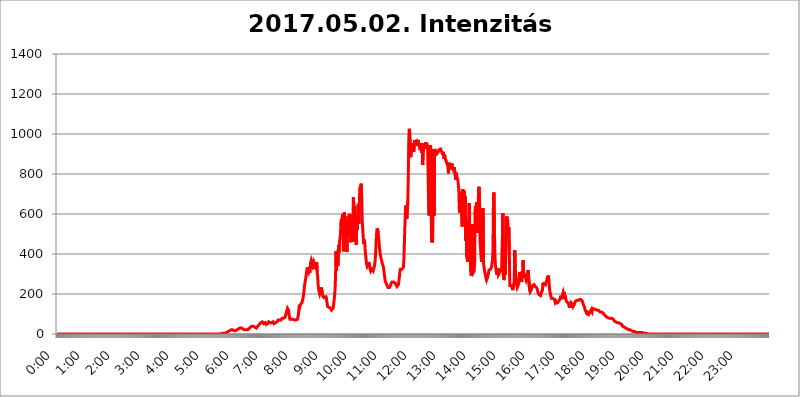
| Category | 2017.05.02. Intenzitás [W/m^2] |
|---|---|
| 0.0 | 0 |
| 0.0006944444444444445 | 0 |
| 0.001388888888888889 | 0 |
| 0.0020833333333333333 | 0 |
| 0.002777777777777778 | 0 |
| 0.003472222222222222 | 0 |
| 0.004166666666666667 | 0 |
| 0.004861111111111111 | 0 |
| 0.005555555555555556 | 0 |
| 0.0062499999999999995 | 0 |
| 0.006944444444444444 | 0 |
| 0.007638888888888889 | 0 |
| 0.008333333333333333 | 0 |
| 0.009027777777777779 | 0 |
| 0.009722222222222222 | 0 |
| 0.010416666666666666 | 0 |
| 0.011111111111111112 | 0 |
| 0.011805555555555555 | 0 |
| 0.012499999999999999 | 0 |
| 0.013194444444444444 | 0 |
| 0.013888888888888888 | 0 |
| 0.014583333333333332 | 0 |
| 0.015277777777777777 | 0 |
| 0.015972222222222224 | 0 |
| 0.016666666666666666 | 0 |
| 0.017361111111111112 | 0 |
| 0.018055555555555557 | 0 |
| 0.01875 | 0 |
| 0.019444444444444445 | 0 |
| 0.02013888888888889 | 0 |
| 0.020833333333333332 | 0 |
| 0.02152777777777778 | 0 |
| 0.022222222222222223 | 0 |
| 0.02291666666666667 | 0 |
| 0.02361111111111111 | 0 |
| 0.024305555555555556 | 0 |
| 0.024999999999999998 | 0 |
| 0.025694444444444447 | 0 |
| 0.02638888888888889 | 0 |
| 0.027083333333333334 | 0 |
| 0.027777777777777776 | 0 |
| 0.02847222222222222 | 0 |
| 0.029166666666666664 | 0 |
| 0.029861111111111113 | 0 |
| 0.030555555555555555 | 0 |
| 0.03125 | 0 |
| 0.03194444444444445 | 0 |
| 0.03263888888888889 | 0 |
| 0.03333333333333333 | 0 |
| 0.034027777777777775 | 0 |
| 0.034722222222222224 | 0 |
| 0.035416666666666666 | 0 |
| 0.036111111111111115 | 0 |
| 0.03680555555555556 | 0 |
| 0.0375 | 0 |
| 0.03819444444444444 | 0 |
| 0.03888888888888889 | 0 |
| 0.03958333333333333 | 0 |
| 0.04027777777777778 | 0 |
| 0.04097222222222222 | 0 |
| 0.041666666666666664 | 0 |
| 0.042361111111111106 | 0 |
| 0.04305555555555556 | 0 |
| 0.043750000000000004 | 0 |
| 0.044444444444444446 | 0 |
| 0.04513888888888889 | 0 |
| 0.04583333333333334 | 0 |
| 0.04652777777777778 | 0 |
| 0.04722222222222222 | 0 |
| 0.04791666666666666 | 0 |
| 0.04861111111111111 | 0 |
| 0.049305555555555554 | 0 |
| 0.049999999999999996 | 0 |
| 0.05069444444444445 | 0 |
| 0.051388888888888894 | 0 |
| 0.052083333333333336 | 0 |
| 0.05277777777777778 | 0 |
| 0.05347222222222222 | 0 |
| 0.05416666666666667 | 0 |
| 0.05486111111111111 | 0 |
| 0.05555555555555555 | 0 |
| 0.05625 | 0 |
| 0.05694444444444444 | 0 |
| 0.057638888888888885 | 0 |
| 0.05833333333333333 | 0 |
| 0.05902777777777778 | 0 |
| 0.059722222222222225 | 0 |
| 0.06041666666666667 | 0 |
| 0.061111111111111116 | 0 |
| 0.06180555555555556 | 0 |
| 0.0625 | 0 |
| 0.06319444444444444 | 0 |
| 0.06388888888888888 | 0 |
| 0.06458333333333334 | 0 |
| 0.06527777777777778 | 0 |
| 0.06597222222222222 | 0 |
| 0.06666666666666667 | 0 |
| 0.06736111111111111 | 0 |
| 0.06805555555555555 | 0 |
| 0.06874999999999999 | 0 |
| 0.06944444444444443 | 0 |
| 0.07013888888888889 | 0 |
| 0.07083333333333333 | 0 |
| 0.07152777777777779 | 0 |
| 0.07222222222222223 | 0 |
| 0.07291666666666667 | 0 |
| 0.07361111111111111 | 0 |
| 0.07430555555555556 | 0 |
| 0.075 | 0 |
| 0.07569444444444444 | 0 |
| 0.0763888888888889 | 0 |
| 0.07708333333333334 | 0 |
| 0.07777777777777778 | 0 |
| 0.07847222222222222 | 0 |
| 0.07916666666666666 | 0 |
| 0.0798611111111111 | 0 |
| 0.08055555555555556 | 0 |
| 0.08125 | 0 |
| 0.08194444444444444 | 0 |
| 0.08263888888888889 | 0 |
| 0.08333333333333333 | 0 |
| 0.08402777777777777 | 0 |
| 0.08472222222222221 | 0 |
| 0.08541666666666665 | 0 |
| 0.08611111111111112 | 0 |
| 0.08680555555555557 | 0 |
| 0.08750000000000001 | 0 |
| 0.08819444444444445 | 0 |
| 0.08888888888888889 | 0 |
| 0.08958333333333333 | 0 |
| 0.09027777777777778 | 0 |
| 0.09097222222222222 | 0 |
| 0.09166666666666667 | 0 |
| 0.09236111111111112 | 0 |
| 0.09305555555555556 | 0 |
| 0.09375 | 0 |
| 0.09444444444444444 | 0 |
| 0.09513888888888888 | 0 |
| 0.09583333333333333 | 0 |
| 0.09652777777777777 | 0 |
| 0.09722222222222222 | 0 |
| 0.09791666666666667 | 0 |
| 0.09861111111111111 | 0 |
| 0.09930555555555555 | 0 |
| 0.09999999999999999 | 0 |
| 0.10069444444444443 | 0 |
| 0.1013888888888889 | 0 |
| 0.10208333333333335 | 0 |
| 0.10277777777777779 | 0 |
| 0.10347222222222223 | 0 |
| 0.10416666666666667 | 0 |
| 0.10486111111111111 | 0 |
| 0.10555555555555556 | 0 |
| 0.10625 | 0 |
| 0.10694444444444444 | 0 |
| 0.1076388888888889 | 0 |
| 0.10833333333333334 | 0 |
| 0.10902777777777778 | 0 |
| 0.10972222222222222 | 0 |
| 0.1111111111111111 | 0 |
| 0.11180555555555556 | 0 |
| 0.11180555555555556 | 0 |
| 0.1125 | 0 |
| 0.11319444444444444 | 0 |
| 0.11388888888888889 | 0 |
| 0.11458333333333333 | 0 |
| 0.11527777777777777 | 0 |
| 0.11597222222222221 | 0 |
| 0.11666666666666665 | 0 |
| 0.1173611111111111 | 0 |
| 0.11805555555555557 | 0 |
| 0.11944444444444445 | 0 |
| 0.12013888888888889 | 0 |
| 0.12083333333333333 | 0 |
| 0.12152777777777778 | 0 |
| 0.12222222222222223 | 0 |
| 0.12291666666666667 | 0 |
| 0.12291666666666667 | 0 |
| 0.12361111111111112 | 0 |
| 0.12430555555555556 | 0 |
| 0.125 | 0 |
| 0.12569444444444444 | 0 |
| 0.12638888888888888 | 0 |
| 0.12708333333333333 | 0 |
| 0.16875 | 0 |
| 0.12847222222222224 | 0 |
| 0.12916666666666668 | 0 |
| 0.12986111111111112 | 0 |
| 0.13055555555555556 | 0 |
| 0.13125 | 0 |
| 0.13194444444444445 | 0 |
| 0.1326388888888889 | 0 |
| 0.13333333333333333 | 0 |
| 0.13402777777777777 | 0 |
| 0.13402777777777777 | 0 |
| 0.13472222222222222 | 0 |
| 0.13541666666666666 | 0 |
| 0.1361111111111111 | 0 |
| 0.13749999999999998 | 0 |
| 0.13819444444444443 | 0 |
| 0.1388888888888889 | 0 |
| 0.13958333333333334 | 0 |
| 0.14027777777777778 | 0 |
| 0.14097222222222222 | 0 |
| 0.14166666666666666 | 0 |
| 0.1423611111111111 | 0 |
| 0.14305555555555557 | 0 |
| 0.14375000000000002 | 0 |
| 0.14444444444444446 | 0 |
| 0.1451388888888889 | 0 |
| 0.1451388888888889 | 0 |
| 0.14652777777777778 | 0 |
| 0.14722222222222223 | 0 |
| 0.14791666666666667 | 0 |
| 0.1486111111111111 | 0 |
| 0.14930555555555555 | 0 |
| 0.15 | 0 |
| 0.15069444444444444 | 0 |
| 0.15138888888888888 | 0 |
| 0.15208333333333332 | 0 |
| 0.15277777777777776 | 0 |
| 0.15347222222222223 | 0 |
| 0.15416666666666667 | 0 |
| 0.15486111111111112 | 0 |
| 0.15555555555555556 | 0 |
| 0.15625 | 0 |
| 0.15694444444444444 | 0 |
| 0.15763888888888888 | 0 |
| 0.15833333333333333 | 0 |
| 0.15902777777777777 | 0 |
| 0.15972222222222224 | 0 |
| 0.16041666666666668 | 0 |
| 0.16111111111111112 | 0 |
| 0.16180555555555556 | 0 |
| 0.1625 | 0 |
| 0.16319444444444445 | 0 |
| 0.1638888888888889 | 0 |
| 0.16458333333333333 | 0 |
| 0.16527777777777777 | 0 |
| 0.16597222222222222 | 0 |
| 0.16666666666666666 | 0 |
| 0.1673611111111111 | 0 |
| 0.16805555555555554 | 0 |
| 0.16874999999999998 | 0 |
| 0.16944444444444443 | 0 |
| 0.17013888888888887 | 0 |
| 0.1708333333333333 | 0 |
| 0.17152777777777775 | 0 |
| 0.17222222222222225 | 0 |
| 0.1729166666666667 | 0 |
| 0.17361111111111113 | 0 |
| 0.17430555555555557 | 0 |
| 0.17500000000000002 | 0 |
| 0.17569444444444446 | 0 |
| 0.1763888888888889 | 0 |
| 0.17708333333333334 | 0 |
| 0.17777777777777778 | 0 |
| 0.17847222222222223 | 0 |
| 0.17916666666666667 | 0 |
| 0.1798611111111111 | 0 |
| 0.18055555555555555 | 0 |
| 0.18125 | 0 |
| 0.18194444444444444 | 0 |
| 0.1826388888888889 | 0 |
| 0.18333333333333335 | 0 |
| 0.1840277777777778 | 0 |
| 0.18472222222222223 | 0 |
| 0.18541666666666667 | 0 |
| 0.18611111111111112 | 0 |
| 0.18680555555555556 | 0 |
| 0.1875 | 0 |
| 0.18819444444444444 | 0 |
| 0.18888888888888888 | 0 |
| 0.18958333333333333 | 0 |
| 0.19027777777777777 | 0 |
| 0.1909722222222222 | 0 |
| 0.19166666666666665 | 0 |
| 0.19236111111111112 | 0 |
| 0.19305555555555554 | 0 |
| 0.19375 | 0 |
| 0.19444444444444445 | 0 |
| 0.1951388888888889 | 0 |
| 0.19583333333333333 | 0 |
| 0.19652777777777777 | 0 |
| 0.19722222222222222 | 0 |
| 0.19791666666666666 | 0 |
| 0.1986111111111111 | 0 |
| 0.19930555555555554 | 0 |
| 0.19999999999999998 | 0 |
| 0.20069444444444443 | 0 |
| 0.20138888888888887 | 0 |
| 0.2020833333333333 | 0 |
| 0.2027777777777778 | 0 |
| 0.2034722222222222 | 0 |
| 0.2041666666666667 | 0 |
| 0.20486111111111113 | 0 |
| 0.20555555555555557 | 0 |
| 0.20625000000000002 | 0 |
| 0.20694444444444446 | 0 |
| 0.2076388888888889 | 0 |
| 0.20833333333333334 | 0 |
| 0.20902777777777778 | 0 |
| 0.20972222222222223 | 0 |
| 0.21041666666666667 | 0 |
| 0.2111111111111111 | 0 |
| 0.21180555555555555 | 0 |
| 0.2125 | 0 |
| 0.21319444444444444 | 0 |
| 0.2138888888888889 | 0 |
| 0.21458333333333335 | 0 |
| 0.2152777777777778 | 0 |
| 0.21597222222222223 | 0 |
| 0.21666666666666667 | 0 |
| 0.21736111111111112 | 0 |
| 0.21805555555555556 | 0 |
| 0.21875 | 0 |
| 0.21944444444444444 | 0 |
| 0.22013888888888888 | 0 |
| 0.22083333333333333 | 0 |
| 0.22152777777777777 | 0 |
| 0.2222222222222222 | 0 |
| 0.22291666666666665 | 0 |
| 0.2236111111111111 | 0 |
| 0.22430555555555556 | 0 |
| 0.225 | 0 |
| 0.22569444444444445 | 0 |
| 0.2263888888888889 | 0 |
| 0.22708333333333333 | 0 |
| 0.22777777777777777 | 0 |
| 0.22847222222222222 | 0 |
| 0.22916666666666666 | 0 |
| 0.2298611111111111 | 3.525 |
| 0.23055555555555554 | 3.525 |
| 0.23124999999999998 | 3.525 |
| 0.23194444444444443 | 3.525 |
| 0.23263888888888887 | 3.525 |
| 0.2333333333333333 | 3.525 |
| 0.2340277777777778 | 3.525 |
| 0.2347222222222222 | 3.525 |
| 0.2354166666666667 | 3.525 |
| 0.23611111111111113 | 3.525 |
| 0.23680555555555557 | 7.887 |
| 0.23750000000000002 | 7.887 |
| 0.23819444444444446 | 7.887 |
| 0.2388888888888889 | 12.257 |
| 0.23958333333333334 | 12.257 |
| 0.24027777777777778 | 12.257 |
| 0.24097222222222223 | 12.257 |
| 0.24166666666666667 | 16.636 |
| 0.2423611111111111 | 21.024 |
| 0.24305555555555555 | 21.024 |
| 0.24375 | 21.024 |
| 0.24444444444444446 | 21.024 |
| 0.24513888888888888 | 21.024 |
| 0.24583333333333335 | 21.024 |
| 0.2465277777777778 | 16.636 |
| 0.24722222222222223 | 16.636 |
| 0.24791666666666667 | 16.636 |
| 0.24861111111111112 | 16.636 |
| 0.24930555555555556 | 16.636 |
| 0.25 | 16.636 |
| 0.25069444444444444 | 16.636 |
| 0.2513888888888889 | 21.024 |
| 0.2520833333333333 | 21.024 |
| 0.25277777777777777 | 21.024 |
| 0.2534722222222222 | 25.419 |
| 0.25416666666666665 | 25.419 |
| 0.2548611111111111 | 25.419 |
| 0.2555555555555556 | 29.823 |
| 0.25625000000000003 | 29.823 |
| 0.2569444444444445 | 29.823 |
| 0.2576388888888889 | 29.823 |
| 0.25833333333333336 | 29.823 |
| 0.2590277777777778 | 29.823 |
| 0.25972222222222224 | 25.419 |
| 0.2604166666666667 | 25.419 |
| 0.2611111111111111 | 21.024 |
| 0.26180555555555557 | 21.024 |
| 0.2625 | 21.024 |
| 0.26319444444444445 | 21.024 |
| 0.2638888888888889 | 21.024 |
| 0.26458333333333334 | 21.024 |
| 0.2652777777777778 | 21.024 |
| 0.2659722222222222 | 21.024 |
| 0.26666666666666666 | 21.024 |
| 0.2673611111111111 | 25.419 |
| 0.26805555555555555 | 25.419 |
| 0.26875 | 25.419 |
| 0.26944444444444443 | 29.823 |
| 0.2701388888888889 | 29.823 |
| 0.2708333333333333 | 34.234 |
| 0.27152777777777776 | 34.234 |
| 0.2722222222222222 | 38.653 |
| 0.27291666666666664 | 38.653 |
| 0.2736111111111111 | 38.653 |
| 0.2743055555555555 | 38.653 |
| 0.27499999999999997 | 38.653 |
| 0.27569444444444446 | 34.234 |
| 0.27638888888888885 | 34.234 |
| 0.27708333333333335 | 34.234 |
| 0.2777777777777778 | 29.823 |
| 0.27847222222222223 | 29.823 |
| 0.2791666666666667 | 29.823 |
| 0.2798611111111111 | 29.823 |
| 0.28055555555555556 | 34.234 |
| 0.28125 | 38.653 |
| 0.28194444444444444 | 38.653 |
| 0.2826388888888889 | 38.653 |
| 0.2833333333333333 | 47.511 |
| 0.28402777777777777 | 51.951 |
| 0.2847222222222222 | 51.951 |
| 0.28541666666666665 | 56.398 |
| 0.28611111111111115 | 60.85 |
| 0.28680555555555554 | 56.398 |
| 0.28750000000000003 | 60.85 |
| 0.2881944444444445 | 60.85 |
| 0.2888888888888889 | 56.398 |
| 0.28958333333333336 | 51.951 |
| 0.2902777777777778 | 51.951 |
| 0.29097222222222224 | 51.951 |
| 0.2916666666666667 | 56.398 |
| 0.2923611111111111 | 51.951 |
| 0.29305555555555557 | 47.511 |
| 0.29375 | 43.079 |
| 0.29444444444444445 | 47.511 |
| 0.2951388888888889 | 51.951 |
| 0.29583333333333334 | 56.398 |
| 0.2965277777777778 | 60.85 |
| 0.2972222222222222 | 60.85 |
| 0.29791666666666666 | 60.85 |
| 0.2986111111111111 | 56.398 |
| 0.29930555555555555 | 56.398 |
| 0.3 | 56.398 |
| 0.30069444444444443 | 56.398 |
| 0.3013888888888889 | 56.398 |
| 0.3020833333333333 | 60.85 |
| 0.30277777777777776 | 60.85 |
| 0.3034722222222222 | 56.398 |
| 0.30416666666666664 | 51.951 |
| 0.3048611111111111 | 51.951 |
| 0.3055555555555555 | 56.398 |
| 0.30624999999999997 | 56.398 |
| 0.3069444444444444 | 56.398 |
| 0.3076388888888889 | 56.398 |
| 0.30833333333333335 | 60.85 |
| 0.3090277777777778 | 65.31 |
| 0.30972222222222223 | 69.775 |
| 0.3104166666666667 | 74.246 |
| 0.3111111111111111 | 74.246 |
| 0.31180555555555556 | 69.775 |
| 0.3125 | 69.775 |
| 0.31319444444444444 | 65.31 |
| 0.3138888888888889 | 69.775 |
| 0.3145833333333333 | 74.246 |
| 0.31527777777777777 | 78.722 |
| 0.3159722222222222 | 78.722 |
| 0.31666666666666665 | 78.722 |
| 0.31736111111111115 | 78.722 |
| 0.31805555555555554 | 74.246 |
| 0.31875000000000003 | 78.722 |
| 0.3194444444444445 | 83.205 |
| 0.3201388888888889 | 92.184 |
| 0.32083333333333336 | 101.184 |
| 0.3215277777777778 | 110.201 |
| 0.32222222222222224 | 119.235 |
| 0.3229166666666667 | 128.284 |
| 0.3236111111111111 | 128.284 |
| 0.32430555555555557 | 119.235 |
| 0.325 | 101.184 |
| 0.32569444444444445 | 83.205 |
| 0.3263888888888889 | 74.246 |
| 0.32708333333333334 | 69.775 |
| 0.3277777777777778 | 69.775 |
| 0.3284722222222222 | 74.246 |
| 0.32916666666666666 | 78.722 |
| 0.3298611111111111 | 78.722 |
| 0.33055555555555555 | 74.246 |
| 0.33125 | 69.775 |
| 0.33194444444444443 | 69.775 |
| 0.3326388888888889 | 69.775 |
| 0.3333333333333333 | 65.31 |
| 0.3340277777777778 | 65.31 |
| 0.3347222222222222 | 69.775 |
| 0.3354166666666667 | 65.31 |
| 0.3361111111111111 | 69.775 |
| 0.3368055555555556 | 74.246 |
| 0.33749999999999997 | 83.205 |
| 0.33819444444444446 | 96.682 |
| 0.33888888888888885 | 123.758 |
| 0.33958333333333335 | 146.423 |
| 0.34027777777777773 | 137.347 |
| 0.34097222222222223 | 146.423 |
| 0.3416666666666666 | 141.884 |
| 0.3423611111111111 | 146.423 |
| 0.3430555555555555 | 155.509 |
| 0.34375 | 164.605 |
| 0.3444444444444445 | 173.709 |
| 0.3451388888888889 | 178.264 |
| 0.3458333333333334 | 205.62 |
| 0.34652777777777777 | 233 |
| 0.34722222222222227 | 251.251 |
| 0.34791666666666665 | 255.813 |
| 0.34861111111111115 | 251.251 |
| 0.34930555555555554 | 296.808 |
| 0.35000000000000003 | 319.517 |
| 0.3506944444444444 | 333.113 |
| 0.3513888888888889 | 328.584 |
| 0.3520833333333333 | 333.113 |
| 0.3527777777777778 | 310.44 |
| 0.3534722222222222 | 319.517 |
| 0.3541666666666667 | 305.898 |
| 0.3548611111111111 | 310.44 |
| 0.35555555555555557 | 360.221 |
| 0.35625 | 369.23 |
| 0.35694444444444445 | 373.729 |
| 0.3576388888888889 | 364.728 |
| 0.35833333333333334 | 342.162 |
| 0.3590277777777778 | 351.198 |
| 0.3597222222222222 | 360.221 |
| 0.36041666666666666 | 351.198 |
| 0.3611111111111111 | 355.712 |
| 0.36180555555555555 | 324.052 |
| 0.3625 | 337.639 |
| 0.36319444444444443 | 333.113 |
| 0.3638888888888889 | 360.221 |
| 0.3645833333333333 | 310.44 |
| 0.3652777777777778 | 287.709 |
| 0.3659722222222222 | 242.127 |
| 0.3666666666666667 | 223.873 |
| 0.3673611111111111 | 210.182 |
| 0.3680555555555556 | 201.058 |
| 0.36874999999999997 | 205.62 |
| 0.36944444444444446 | 219.309 |
| 0.37013888888888885 | 233 |
| 0.37083333333333335 | 228.436 |
| 0.37152777777777773 | 210.182 |
| 0.37222222222222223 | 191.937 |
| 0.3729166666666666 | 187.378 |
| 0.3736111111111111 | 182.82 |
| 0.3743055555555555 | 178.264 |
| 0.375 | 182.82 |
| 0.3756944444444445 | 182.82 |
| 0.3763888888888889 | 191.937 |
| 0.3770833333333334 | 187.378 |
| 0.37777777777777777 | 169.156 |
| 0.37847222222222227 | 155.509 |
| 0.37916666666666665 | 137.347 |
| 0.37986111111111115 | 132.814 |
| 0.38055555555555554 | 132.814 |
| 0.38125000000000003 | 132.814 |
| 0.3819444444444444 | 128.284 |
| 0.3826388888888889 | 128.284 |
| 0.3833333333333333 | 128.284 |
| 0.3840277777777778 | 123.758 |
| 0.3847222222222222 | 119.235 |
| 0.3854166666666667 | 119.235 |
| 0.3861111111111111 | 123.758 |
| 0.38680555555555557 | 128.284 |
| 0.3875 | 141.884 |
| 0.38819444444444445 | 164.605 |
| 0.3888888888888889 | 187.378 |
| 0.38958333333333334 | 219.309 |
| 0.3902777777777778 | 283.156 |
| 0.3909722222222222 | 414.035 |
| 0.39166666666666666 | 314.98 |
| 0.3923611111111111 | 378.224 |
| 0.39305555555555555 | 373.729 |
| 0.39375 | 342.162 |
| 0.39444444444444443 | 445.129 |
| 0.3951388888888889 | 405.108 |
| 0.3958333333333333 | 458.38 |
| 0.3965277777777778 | 475.972 |
| 0.3972222222222222 | 497.836 |
| 0.3979166666666667 | 566.793 |
| 0.3986111111111111 | 566.793 |
| 0.3993055555555556 | 575.299 |
| 0.39999999999999997 | 592.233 |
| 0.40069444444444446 | 600.661 |
| 0.40138888888888885 | 414.035 |
| 0.40208333333333335 | 562.53 |
| 0.40277777777777773 | 609.062 |
| 0.40347222222222223 | 562.53 |
| 0.4041666666666666 | 588.009 |
| 0.4048611111111111 | 549.704 |
| 0.4055555555555555 | 566.793 |
| 0.40625 | 409.574 |
| 0.4069444444444445 | 566.793 |
| 0.4076388888888889 | 493.475 |
| 0.4083333333333334 | 558.261 |
| 0.40902777777777777 | 592.233 |
| 0.40972222222222227 | 600.661 |
| 0.41041666666666665 | 600.661 |
| 0.41111111111111115 | 579.542 |
| 0.41180555555555554 | 458.38 |
| 0.41250000000000003 | 596.45 |
| 0.4131944444444444 | 515.223 |
| 0.4138888888888889 | 462.786 |
| 0.4145833333333333 | 528.2 |
| 0.4152777777777778 | 683.473 |
| 0.4159722222222222 | 642.4 |
| 0.4166666666666667 | 613.252 |
| 0.4173611111111111 | 638.256 |
| 0.41805555555555557 | 462.786 |
| 0.41875 | 549.704 |
| 0.41944444444444445 | 445.129 |
| 0.4201388888888889 | 596.45 |
| 0.42083333333333334 | 519.555 |
| 0.4215277777777778 | 592.233 |
| 0.4222222222222222 | 650.667 |
| 0.42291666666666666 | 549.704 |
| 0.4236111111111111 | 646.537 |
| 0.42430555555555555 | 727.896 |
| 0.425 | 727.896 |
| 0.42569444444444443 | 743.859 |
| 0.4263888888888889 | 751.803 |
| 0.4270833333333333 | 658.909 |
| 0.4277777777777778 | 562.53 |
| 0.4284722222222222 | 562.53 |
| 0.4291666666666667 | 480.356 |
| 0.4298611111111111 | 449.551 |
| 0.4305555555555556 | 471.582 |
| 0.43124999999999997 | 458.38 |
| 0.43194444444444446 | 414.035 |
| 0.43263888888888885 | 391.685 |
| 0.43333333333333335 | 364.728 |
| 0.43402777777777773 | 346.682 |
| 0.43472222222222223 | 337.639 |
| 0.4354166666666666 | 333.113 |
| 0.4361111111111111 | 346.682 |
| 0.4368055555555555 | 360.221 |
| 0.4375 | 355.712 |
| 0.4381944444444445 | 337.639 |
| 0.4388888888888889 | 324.052 |
| 0.4395833333333334 | 314.98 |
| 0.44027777777777777 | 314.98 |
| 0.44097222222222227 | 324.052 |
| 0.44166666666666665 | 319.517 |
| 0.44236111111111115 | 319.517 |
| 0.44305555555555554 | 314.98 |
| 0.44375000000000003 | 319.517 |
| 0.4444444444444444 | 333.113 |
| 0.4451388888888889 | 346.682 |
| 0.4458333333333333 | 364.728 |
| 0.4465277777777778 | 405.108 |
| 0.4472222222222222 | 458.38 |
| 0.4479166666666667 | 502.192 |
| 0.4486111111111111 | 528.2 |
| 0.44930555555555557 | 523.88 |
| 0.45 | 515.223 |
| 0.45069444444444445 | 484.735 |
| 0.4513888888888889 | 458.38 |
| 0.45208333333333334 | 427.39 |
| 0.4527777777777778 | 405.108 |
| 0.4534722222222222 | 391.685 |
| 0.45416666666666666 | 378.224 |
| 0.4548611111111111 | 369.23 |
| 0.45555555555555555 | 355.712 |
| 0.45625 | 351.198 |
| 0.45694444444444443 | 342.162 |
| 0.4576388888888889 | 328.584 |
| 0.4583333333333333 | 310.44 |
| 0.4590277777777778 | 292.259 |
| 0.4597222222222222 | 269.49 |
| 0.4604166666666667 | 260.373 |
| 0.4611111111111111 | 255.813 |
| 0.4618055555555556 | 251.251 |
| 0.46249999999999997 | 242.127 |
| 0.46319444444444446 | 242.127 |
| 0.46388888888888885 | 233 |
| 0.46458333333333335 | 228.436 |
| 0.46527777777777773 | 228.436 |
| 0.46597222222222223 | 233 |
| 0.4666666666666666 | 237.564 |
| 0.4673611111111111 | 242.127 |
| 0.4680555555555555 | 251.251 |
| 0.46875 | 255.813 |
| 0.4694444444444445 | 260.373 |
| 0.4701388888888889 | 264.932 |
| 0.4708333333333334 | 264.932 |
| 0.47152777777777777 | 260.373 |
| 0.47222222222222227 | 260.373 |
| 0.47291666666666665 | 260.373 |
| 0.47361111111111115 | 255.813 |
| 0.47430555555555554 | 251.251 |
| 0.47500000000000003 | 246.689 |
| 0.4756944444444444 | 242.127 |
| 0.4763888888888889 | 237.564 |
| 0.4770833333333333 | 233 |
| 0.4777777777777778 | 237.564 |
| 0.4784722222222222 | 246.689 |
| 0.4791666666666667 | 264.932 |
| 0.4798611111111111 | 287.709 |
| 0.48055555555555557 | 310.44 |
| 0.48125 | 324.052 |
| 0.48194444444444445 | 328.584 |
| 0.4826388888888889 | 324.052 |
| 0.48333333333333334 | 324.052 |
| 0.4840277777777778 | 319.517 |
| 0.4847222222222222 | 319.517 |
| 0.48541666666666666 | 333.113 |
| 0.4861111111111111 | 369.23 |
| 0.48680555555555555 | 445.129 |
| 0.4875 | 532.513 |
| 0.48819444444444443 | 600.661 |
| 0.4888888888888889 | 642.4 |
| 0.4895833333333333 | 617.436 |
| 0.4902777777777778 | 575.299 |
| 0.4909722222222222 | 571.049 |
| 0.4916666666666667 | 663.019 |
| 0.4923611111111111 | 791.169 |
| 0.4930555555555556 | 977.508 |
| 0.49374999999999997 | 1026.06 |
| 0.49444444444444446 | 1003.65 |
| 0.49513888888888885 | 962.555 |
| 0.49583333333333335 | 883.516 |
| 0.49652777777777773 | 936.33 |
| 0.49722222222222223 | 943.832 |
| 0.4979166666666666 | 955.071 |
| 0.4986111111111111 | 932.576 |
| 0.4993055555555555 | 928.819 |
| 0.5 | 909.996 |
| 0.5006944444444444 | 943.832 |
| 0.5013888888888889 | 970.034 |
| 0.5020833333333333 | 966.295 |
| 0.5027777777777778 | 955.071 |
| 0.5034722222222222 | 951.327 |
| 0.5041666666666667 | 962.555 |
| 0.5048611111111111 | 962.555 |
| 0.5055555555555555 | 940.082 |
| 0.50625 | 970.034 |
| 0.5069444444444444 | 951.327 |
| 0.5076388888888889 | 940.082 |
| 0.5083333333333333 | 943.832 |
| 0.5090277777777777 | 955.071 |
| 0.5097222222222222 | 955.071 |
| 0.5104166666666666 | 958.814 |
| 0.5111111111111112 | 906.223 |
| 0.5118055555555555 | 951.327 |
| 0.5125000000000001 | 845.365 |
| 0.5131944444444444 | 902.447 |
| 0.513888888888889 | 925.06 |
| 0.5145833333333333 | 955.071 |
| 0.5152777777777778 | 951.327 |
| 0.5159722222222222 | 925.06 |
| 0.5166666666666667 | 958.814 |
| 0.517361111111111 | 928.819 |
| 0.5180555555555556 | 955.071 |
| 0.5187499999999999 | 943.832 |
| 0.5194444444444445 | 936.33 |
| 0.5201388888888888 | 798.974 |
| 0.5208333333333334 | 654.791 |
| 0.5215277777777778 | 592.233 |
| 0.5222222222222223 | 883.516 |
| 0.5229166666666667 | 932.576 |
| 0.5236111111111111 | 943.832 |
| 0.5243055555555556 | 667.123 |
| 0.525 | 458.38 |
| 0.5256944444444445 | 471.582 |
| 0.5263888888888889 | 458.38 |
| 0.5270833333333333 | 798.974 |
| 0.5277777777777778 | 925.06 |
| 0.5284722222222222 | 592.233 |
| 0.5291666666666667 | 906.223 |
| 0.5298611111111111 | 925.06 |
| 0.5305555555555556 | 891.099 |
| 0.53125 | 909.996 |
| 0.5319444444444444 | 909.996 |
| 0.5326388888888889 | 902.447 |
| 0.5333333333333333 | 902.447 |
| 0.5340277777777778 | 906.223 |
| 0.5347222222222222 | 913.766 |
| 0.5354166666666667 | 921.298 |
| 0.5361111111111111 | 925.06 |
| 0.5368055555555555 | 917.534 |
| 0.5375 | 925.06 |
| 0.5381944444444444 | 925.06 |
| 0.5388888888888889 | 928.819 |
| 0.5395833333333333 | 909.996 |
| 0.5402777777777777 | 894.885 |
| 0.5409722222222222 | 909.996 |
| 0.5416666666666666 | 902.447 |
| 0.5423611111111112 | 875.918 |
| 0.5430555555555555 | 898.668 |
| 0.5437500000000001 | 887.309 |
| 0.5444444444444444 | 875.918 |
| 0.545138888888889 | 868.305 |
| 0.5458333333333333 | 872.114 |
| 0.5465277777777778 | 853.029 |
| 0.5472222222222222 | 845.365 |
| 0.5479166666666667 | 837.682 |
| 0.548611111111111 | 802.868 |
| 0.5493055555555556 | 849.199 |
| 0.5499999999999999 | 856.855 |
| 0.5506944444444445 | 829.981 |
| 0.5513888888888888 | 822.26 |
| 0.5520833333333334 | 837.682 |
| 0.5527777777777778 | 845.365 |
| 0.5534722222222223 | 853.029 |
| 0.5541666666666667 | 837.682 |
| 0.5548611111111111 | 833.834 |
| 0.5555555555555556 | 822.26 |
| 0.55625 | 826.123 |
| 0.5569444444444445 | 833.834 |
| 0.5576388888888889 | 806.757 |
| 0.5583333333333333 | 783.342 |
| 0.5590277777777778 | 771.559 |
| 0.5597222222222222 | 806.757 |
| 0.5604166666666667 | 783.342 |
| 0.5611111111111111 | 779.42 |
| 0.5618055555555556 | 771.559 |
| 0.5625 | 747.834 |
| 0.5631944444444444 | 719.877 |
| 0.5638888888888889 | 625.784 |
| 0.5645833333333333 | 604.864 |
| 0.5652777777777778 | 634.105 |
| 0.5659722222222222 | 646.537 |
| 0.5666666666666667 | 711.832 |
| 0.5673611111111111 | 707.8 |
| 0.5680555555555555 | 536.82 |
| 0.56875 | 723.889 |
| 0.5694444444444444 | 695.666 |
| 0.5701388888888889 | 703.762 |
| 0.5708333333333333 | 715.858 |
| 0.5715277777777777 | 650.667 |
| 0.5722222222222222 | 687.544 |
| 0.5729166666666666 | 467.187 |
| 0.5736111111111112 | 575.299 |
| 0.5743055555555555 | 387.202 |
| 0.5750000000000001 | 373.729 |
| 0.5756944444444444 | 360.221 |
| 0.576388888888889 | 360.221 |
| 0.5770833333333333 | 549.704 |
| 0.5777777777777778 | 654.791 |
| 0.5784722222222222 | 475.972 |
| 0.5791666666666667 | 489.108 |
| 0.579861111111111 | 314.98 |
| 0.5805555555555556 | 292.259 |
| 0.5812499999999999 | 310.44 |
| 0.5819444444444445 | 549.704 |
| 0.5826388888888888 | 324.052 |
| 0.5833333333333334 | 305.898 |
| 0.5840277777777778 | 301.354 |
| 0.5847222222222223 | 314.98 |
| 0.5854166666666667 | 360.221 |
| 0.5861111111111111 | 625.784 |
| 0.5868055555555556 | 629.948 |
| 0.5875 | 642.4 |
| 0.5881944444444445 | 658.909 |
| 0.5888888888888889 | 642.4 |
| 0.5895833333333333 | 506.542 |
| 0.5902777777777778 | 617.436 |
| 0.5909722222222222 | 727.896 |
| 0.5916666666666667 | 735.89 |
| 0.5923611111111111 | 650.667 |
| 0.5930555555555556 | 453.968 |
| 0.59375 | 422.943 |
| 0.5944444444444444 | 382.715 |
| 0.5951388888888889 | 360.221 |
| 0.5958333333333333 | 422.943 |
| 0.5965277777777778 | 617.436 |
| 0.5972222222222222 | 629.948 |
| 0.5979166666666667 | 351.198 |
| 0.5986111111111111 | 333.113 |
| 0.5993055555555555 | 314.98 |
| 0.6 | 301.354 |
| 0.6006944444444444 | 292.259 |
| 0.6013888888888889 | 278.603 |
| 0.6020833333333333 | 269.49 |
| 0.6027777777777777 | 274.047 |
| 0.6034722222222222 | 283.156 |
| 0.6041666666666666 | 292.259 |
| 0.6048611111111112 | 305.898 |
| 0.6055555555555555 | 319.517 |
| 0.6062500000000001 | 324.052 |
| 0.6069444444444444 | 314.98 |
| 0.607638888888889 | 324.052 |
| 0.6083333333333333 | 328.584 |
| 0.6090277777777778 | 333.113 |
| 0.6097222222222222 | 351.198 |
| 0.6104166666666667 | 369.23 |
| 0.611111111111111 | 414.035 |
| 0.6118055555555556 | 675.311 |
| 0.6124999999999999 | 707.8 |
| 0.6131944444444445 | 510.885 |
| 0.6138888888888888 | 391.685 |
| 0.6145833333333334 | 346.682 |
| 0.6152777777777778 | 324.052 |
| 0.6159722222222223 | 305.898 |
| 0.6166666666666667 | 296.808 |
| 0.6173611111111111 | 292.259 |
| 0.6180555555555556 | 328.584 |
| 0.61875 | 296.808 |
| 0.6194444444444445 | 296.808 |
| 0.6201388888888889 | 301.354 |
| 0.6208333333333333 | 310.44 |
| 0.6215277777777778 | 314.98 |
| 0.6222222222222222 | 319.517 |
| 0.6229166666666667 | 319.517 |
| 0.6236111111111111 | 310.44 |
| 0.6243055555555556 | 310.44 |
| 0.625 | 604.864 |
| 0.6256944444444444 | 292.259 |
| 0.6263888888888889 | 269.49 |
| 0.6270833333333333 | 287.709 |
| 0.6277777777777778 | 319.517 |
| 0.6284722222222222 | 296.808 |
| 0.6291666666666667 | 301.354 |
| 0.6298611111111111 | 575.299 |
| 0.6305555555555555 | 588.009 |
| 0.63125 | 583.779 |
| 0.6319444444444444 | 562.53 |
| 0.6326388888888889 | 497.836 |
| 0.6333333333333333 | 532.513 |
| 0.6340277777777777 | 418.492 |
| 0.6347222222222222 | 242.127 |
| 0.6354166666666666 | 242.127 |
| 0.6361111111111112 | 242.127 |
| 0.6368055555555555 | 242.127 |
| 0.6375000000000001 | 237.564 |
| 0.6381944444444444 | 228.436 |
| 0.638888888888889 | 219.309 |
| 0.6395833333333333 | 219.309 |
| 0.6402777777777778 | 251.251 |
| 0.6409722222222222 | 242.127 |
| 0.6416666666666667 | 418.492 |
| 0.642361111111111 | 333.113 |
| 0.6430555555555556 | 292.259 |
| 0.6437499999999999 | 287.709 |
| 0.6444444444444445 | 246.689 |
| 0.6451388888888888 | 233 |
| 0.6458333333333334 | 233 |
| 0.6465277777777778 | 237.564 |
| 0.6472222222222223 | 251.251 |
| 0.6479166666666667 | 269.49 |
| 0.6486111111111111 | 310.44 |
| 0.6493055555555556 | 296.808 |
| 0.65 | 287.709 |
| 0.6506944444444445 | 287.709 |
| 0.6513888888888889 | 260.373 |
| 0.6520833333333333 | 310.44 |
| 0.6527777777777778 | 283.156 |
| 0.6534722222222222 | 369.23 |
| 0.6541666666666667 | 301.354 |
| 0.6548611111111111 | 305.898 |
| 0.6555555555555556 | 305.898 |
| 0.65625 | 296.808 |
| 0.6569444444444444 | 278.603 |
| 0.6576388888888889 | 269.49 |
| 0.6583333333333333 | 269.49 |
| 0.6590277777777778 | 287.709 |
| 0.6597222222222222 | 264.932 |
| 0.6604166666666667 | 319.517 |
| 0.6611111111111111 | 324.052 |
| 0.6618055555555555 | 324.052 |
| 0.6625 | 219.309 |
| 0.6631944444444444 | 210.182 |
| 0.6638888888888889 | 214.746 |
| 0.6645833333333333 | 219.309 |
| 0.6652777777777777 | 223.873 |
| 0.6659722222222222 | 233 |
| 0.6666666666666666 | 242.127 |
| 0.6673611111111111 | 246.689 |
| 0.6680555555555556 | 246.689 |
| 0.6687500000000001 | 246.689 |
| 0.6694444444444444 | 242.127 |
| 0.6701388888888888 | 237.564 |
| 0.6708333333333334 | 242.127 |
| 0.6715277777777778 | 237.564 |
| 0.6722222222222222 | 233 |
| 0.6729166666666666 | 228.436 |
| 0.6736111111111112 | 219.309 |
| 0.6743055555555556 | 205.62 |
| 0.6749999999999999 | 201.058 |
| 0.6756944444444444 | 196.497 |
| 0.6763888888888889 | 196.497 |
| 0.6770833333333334 | 191.937 |
| 0.6777777777777777 | 191.937 |
| 0.6784722222222223 | 196.497 |
| 0.6791666666666667 | 210.182 |
| 0.6798611111111111 | 214.746 |
| 0.6805555555555555 | 219.309 |
| 0.68125 | 255.813 |
| 0.6819444444444445 | 242.127 |
| 0.6826388888888889 | 251.251 |
| 0.6833333333333332 | 251.251 |
| 0.6840277777777778 | 246.689 |
| 0.6847222222222222 | 246.689 |
| 0.6854166666666667 | 255.813 |
| 0.686111111111111 | 260.373 |
| 0.6868055555555556 | 269.49 |
| 0.6875 | 287.709 |
| 0.6881944444444444 | 269.49 |
| 0.688888888888889 | 292.259 |
| 0.6895833333333333 | 260.373 |
| 0.6902777777777778 | 233 |
| 0.6909722222222222 | 210.182 |
| 0.6916666666666668 | 201.058 |
| 0.6923611111111111 | 187.378 |
| 0.6930555555555555 | 178.264 |
| 0.69375 | 173.709 |
| 0.6944444444444445 | 173.709 |
| 0.6951388888888889 | 178.264 |
| 0.6958333333333333 | 178.264 |
| 0.6965277777777777 | 178.264 |
| 0.6972222222222223 | 173.709 |
| 0.6979166666666666 | 164.605 |
| 0.6986111111111111 | 173.709 |
| 0.6993055555555556 | 155.509 |
| 0.7000000000000001 | 150.964 |
| 0.7006944444444444 | 150.964 |
| 0.7013888888888888 | 155.509 |
| 0.7020833333333334 | 150.964 |
| 0.7027777777777778 | 160.056 |
| 0.7034722222222222 | 164.605 |
| 0.7041666666666666 | 169.156 |
| 0.7048611111111112 | 169.156 |
| 0.7055555555555556 | 178.264 |
| 0.7062499999999999 | 191.937 |
| 0.7069444444444444 | 182.82 |
| 0.7076388888888889 | 173.709 |
| 0.7083333333333334 | 178.264 |
| 0.7090277777777777 | 201.058 |
| 0.7097222222222223 | 210.182 |
| 0.7104166666666667 | 201.058 |
| 0.7111111111111111 | 210.182 |
| 0.7118055555555555 | 178.264 |
| 0.7125 | 191.937 |
| 0.7131944444444445 | 173.709 |
| 0.7138888888888889 | 169.156 |
| 0.7145833333333332 | 160.056 |
| 0.7152777777777778 | 164.605 |
| 0.7159722222222222 | 164.605 |
| 0.7166666666666667 | 155.509 |
| 0.717361111111111 | 155.509 |
| 0.7180555555555556 | 137.347 |
| 0.71875 | 132.814 |
| 0.7194444444444444 | 137.347 |
| 0.720138888888889 | 137.347 |
| 0.7208333333333333 | 155.509 |
| 0.7215277777777778 | 155.509 |
| 0.7222222222222222 | 155.509 |
| 0.7229166666666668 | 146.423 |
| 0.7236111111111111 | 137.347 |
| 0.7243055555555555 | 141.884 |
| 0.725 | 146.423 |
| 0.7256944444444445 | 155.509 |
| 0.7263888888888889 | 160.056 |
| 0.7270833333333333 | 164.605 |
| 0.7277777777777777 | 169.156 |
| 0.7284722222222223 | 169.156 |
| 0.7291666666666666 | 169.156 |
| 0.7298611111111111 | 169.156 |
| 0.7305555555555556 | 169.156 |
| 0.7312500000000001 | 169.156 |
| 0.7319444444444444 | 169.156 |
| 0.7326388888888888 | 169.156 |
| 0.7333333333333334 | 173.709 |
| 0.7340277777777778 | 169.156 |
| 0.7347222222222222 | 169.156 |
| 0.7354166666666666 | 169.156 |
| 0.7361111111111112 | 169.156 |
| 0.7368055555555556 | 160.056 |
| 0.7374999999999999 | 150.964 |
| 0.7381944444444444 | 146.423 |
| 0.7388888888888889 | 150.964 |
| 0.7395833333333334 | 132.814 |
| 0.7402777777777777 | 119.235 |
| 0.7409722222222223 | 119.235 |
| 0.7416666666666667 | 110.201 |
| 0.7423611111111111 | 119.235 |
| 0.7430555555555555 | 101.184 |
| 0.74375 | 101.184 |
| 0.7444444444444445 | 96.682 |
| 0.7451388888888889 | 96.682 |
| 0.7458333333333332 | 96.682 |
| 0.7465277777777778 | 96.682 |
| 0.7472222222222222 | 110.201 |
| 0.7479166666666667 | 105.69 |
| 0.748611111111111 | 119.235 |
| 0.7493055555555556 | 119.235 |
| 0.75 | 110.201 |
| 0.7506944444444444 | 128.284 |
| 0.751388888888889 | 128.284 |
| 0.7520833333333333 | 123.758 |
| 0.7527777777777778 | 123.758 |
| 0.7534722222222222 | 123.758 |
| 0.7541666666666668 | 123.758 |
| 0.7548611111111111 | 123.758 |
| 0.7555555555555555 | 119.235 |
| 0.75625 | 119.235 |
| 0.7569444444444445 | 119.235 |
| 0.7576388888888889 | 119.235 |
| 0.7583333333333333 | 119.235 |
| 0.7590277777777777 | 119.235 |
| 0.7597222222222223 | 114.716 |
| 0.7604166666666666 | 114.716 |
| 0.7611111111111111 | 110.201 |
| 0.7618055555555556 | 110.201 |
| 0.7625000000000001 | 110.201 |
| 0.7631944444444444 | 110.201 |
| 0.7638888888888888 | 110.201 |
| 0.7645833333333334 | 110.201 |
| 0.7652777777777778 | 105.69 |
| 0.7659722222222222 | 105.69 |
| 0.7666666666666666 | 101.184 |
| 0.7673611111111112 | 96.682 |
| 0.7680555555555556 | 96.682 |
| 0.7687499999999999 | 92.184 |
| 0.7694444444444444 | 87.692 |
| 0.7701388888888889 | 87.692 |
| 0.7708333333333334 | 83.205 |
| 0.7715277777777777 | 83.205 |
| 0.7722222222222223 | 78.722 |
| 0.7729166666666667 | 78.722 |
| 0.7736111111111111 | 78.722 |
| 0.7743055555555555 | 74.246 |
| 0.775 | 78.722 |
| 0.7756944444444445 | 78.722 |
| 0.7763888888888889 | 83.205 |
| 0.7770833333333332 | 78.722 |
| 0.7777777777777778 | 78.722 |
| 0.7784722222222222 | 78.722 |
| 0.7791666666666667 | 74.246 |
| 0.779861111111111 | 74.246 |
| 0.7805555555555556 | 69.775 |
| 0.78125 | 65.31 |
| 0.7819444444444444 | 65.31 |
| 0.782638888888889 | 60.85 |
| 0.7833333333333333 | 60.85 |
| 0.7840277777777778 | 60.85 |
| 0.7847222222222222 | 60.85 |
| 0.7854166666666668 | 56.398 |
| 0.7861111111111111 | 56.398 |
| 0.7868055555555555 | 56.398 |
| 0.7875 | 56.398 |
| 0.7881944444444445 | 56.398 |
| 0.7888888888888889 | 51.951 |
| 0.7895833333333333 | 51.951 |
| 0.7902777777777777 | 47.511 |
| 0.7909722222222223 | 47.511 |
| 0.7916666666666666 | 47.511 |
| 0.7923611111111111 | 43.079 |
| 0.7930555555555556 | 38.653 |
| 0.7937500000000001 | 38.653 |
| 0.7944444444444444 | 34.234 |
| 0.7951388888888888 | 34.234 |
| 0.7958333333333334 | 29.823 |
| 0.7965277777777778 | 29.823 |
| 0.7972222222222222 | 29.823 |
| 0.7979166666666666 | 29.823 |
| 0.7986111111111112 | 29.823 |
| 0.7993055555555556 | 25.419 |
| 0.7999999999999999 | 25.419 |
| 0.8006944444444444 | 25.419 |
| 0.8013888888888889 | 21.024 |
| 0.8020833333333334 | 21.024 |
| 0.8027777777777777 | 21.024 |
| 0.8034722222222223 | 21.024 |
| 0.8041666666666667 | 16.636 |
| 0.8048611111111111 | 16.636 |
| 0.8055555555555555 | 16.636 |
| 0.80625 | 16.636 |
| 0.8069444444444445 | 12.257 |
| 0.8076388888888889 | 12.257 |
| 0.8083333333333332 | 12.257 |
| 0.8090277777777778 | 12.257 |
| 0.8097222222222222 | 12.257 |
| 0.8104166666666667 | 12.257 |
| 0.811111111111111 | 12.257 |
| 0.8118055555555556 | 7.887 |
| 0.8125 | 7.887 |
| 0.8131944444444444 | 7.887 |
| 0.813888888888889 | 7.887 |
| 0.8145833333333333 | 7.887 |
| 0.8152777777777778 | 7.887 |
| 0.8159722222222222 | 7.887 |
| 0.8166666666666668 | 7.887 |
| 0.8173611111111111 | 7.887 |
| 0.8180555555555555 | 7.887 |
| 0.81875 | 7.887 |
| 0.8194444444444445 | 7.887 |
| 0.8201388888888889 | 7.887 |
| 0.8208333333333333 | 7.887 |
| 0.8215277777777777 | 7.887 |
| 0.8222222222222223 | 3.525 |
| 0.8229166666666666 | 3.525 |
| 0.8236111111111111 | 3.525 |
| 0.8243055555555556 | 3.525 |
| 0.8250000000000001 | 3.525 |
| 0.8256944444444444 | 3.525 |
| 0.8263888888888888 | 3.525 |
| 0.8270833333333334 | 3.525 |
| 0.8277777777777778 | 3.525 |
| 0.8284722222222222 | 0 |
| 0.8291666666666666 | 0 |
| 0.8298611111111112 | 0 |
| 0.8305555555555556 | 0 |
| 0.8312499999999999 | 0 |
| 0.8319444444444444 | 0 |
| 0.8326388888888889 | 0 |
| 0.8333333333333334 | 0 |
| 0.8340277777777777 | 0 |
| 0.8347222222222223 | 0 |
| 0.8354166666666667 | 0 |
| 0.8361111111111111 | 0 |
| 0.8368055555555555 | 0 |
| 0.8375 | 0 |
| 0.8381944444444445 | 0 |
| 0.8388888888888889 | 0 |
| 0.8395833333333332 | 0 |
| 0.8402777777777778 | 0 |
| 0.8409722222222222 | 0 |
| 0.8416666666666667 | 0 |
| 0.842361111111111 | 0 |
| 0.8430555555555556 | 0 |
| 0.84375 | 0 |
| 0.8444444444444444 | 0 |
| 0.845138888888889 | 0 |
| 0.8458333333333333 | 0 |
| 0.8465277777777778 | 0 |
| 0.8472222222222222 | 0 |
| 0.8479166666666668 | 0 |
| 0.8486111111111111 | 0 |
| 0.8493055555555555 | 0 |
| 0.85 | 0 |
| 0.8506944444444445 | 0 |
| 0.8513888888888889 | 0 |
| 0.8520833333333333 | 0 |
| 0.8527777777777777 | 0 |
| 0.8534722222222223 | 0 |
| 0.8541666666666666 | 0 |
| 0.8548611111111111 | 0 |
| 0.8555555555555556 | 0 |
| 0.8562500000000001 | 0 |
| 0.8569444444444444 | 0 |
| 0.8576388888888888 | 0 |
| 0.8583333333333334 | 0 |
| 0.8590277777777778 | 0 |
| 0.8597222222222222 | 0 |
| 0.8604166666666666 | 0 |
| 0.8611111111111112 | 0 |
| 0.8618055555555556 | 0 |
| 0.8624999999999999 | 0 |
| 0.8631944444444444 | 0 |
| 0.8638888888888889 | 0 |
| 0.8645833333333334 | 0 |
| 0.8652777777777777 | 0 |
| 0.8659722222222223 | 0 |
| 0.8666666666666667 | 0 |
| 0.8673611111111111 | 0 |
| 0.8680555555555555 | 0 |
| 0.86875 | 0 |
| 0.8694444444444445 | 0 |
| 0.8701388888888889 | 0 |
| 0.8708333333333332 | 0 |
| 0.8715277777777778 | 0 |
| 0.8722222222222222 | 0 |
| 0.8729166666666667 | 0 |
| 0.873611111111111 | 0 |
| 0.8743055555555556 | 0 |
| 0.875 | 0 |
| 0.8756944444444444 | 0 |
| 0.876388888888889 | 0 |
| 0.8770833333333333 | 0 |
| 0.8777777777777778 | 0 |
| 0.8784722222222222 | 0 |
| 0.8791666666666668 | 0 |
| 0.8798611111111111 | 0 |
| 0.8805555555555555 | 0 |
| 0.88125 | 0 |
| 0.8819444444444445 | 0 |
| 0.8826388888888889 | 0 |
| 0.8833333333333333 | 0 |
| 0.8840277777777777 | 0 |
| 0.8847222222222223 | 0 |
| 0.8854166666666666 | 0 |
| 0.8861111111111111 | 0 |
| 0.8868055555555556 | 0 |
| 0.8875000000000001 | 0 |
| 0.8881944444444444 | 0 |
| 0.8888888888888888 | 0 |
| 0.8895833333333334 | 0 |
| 0.8902777777777778 | 0 |
| 0.8909722222222222 | 0 |
| 0.8916666666666666 | 0 |
| 0.8923611111111112 | 0 |
| 0.8930555555555556 | 0 |
| 0.8937499999999999 | 0 |
| 0.8944444444444444 | 0 |
| 0.8951388888888889 | 0 |
| 0.8958333333333334 | 0 |
| 0.8965277777777777 | 0 |
| 0.8972222222222223 | 0 |
| 0.8979166666666667 | 0 |
| 0.8986111111111111 | 0 |
| 0.8993055555555555 | 0 |
| 0.9 | 0 |
| 0.9006944444444445 | 0 |
| 0.9013888888888889 | 0 |
| 0.9020833333333332 | 0 |
| 0.9027777777777778 | 0 |
| 0.9034722222222222 | 0 |
| 0.9041666666666667 | 0 |
| 0.904861111111111 | 0 |
| 0.9055555555555556 | 0 |
| 0.90625 | 0 |
| 0.9069444444444444 | 0 |
| 0.907638888888889 | 0 |
| 0.9083333333333333 | 0 |
| 0.9090277777777778 | 0 |
| 0.9097222222222222 | 0 |
| 0.9104166666666668 | 0 |
| 0.9111111111111111 | 0 |
| 0.9118055555555555 | 0 |
| 0.9125 | 0 |
| 0.9131944444444445 | 0 |
| 0.9138888888888889 | 0 |
| 0.9145833333333333 | 0 |
| 0.9152777777777777 | 0 |
| 0.9159722222222223 | 0 |
| 0.9166666666666666 | 0 |
| 0.9173611111111111 | 0 |
| 0.9180555555555556 | 0 |
| 0.9187500000000001 | 0 |
| 0.9194444444444444 | 0 |
| 0.9201388888888888 | 0 |
| 0.9208333333333334 | 0 |
| 0.9215277777777778 | 0 |
| 0.9222222222222222 | 0 |
| 0.9229166666666666 | 0 |
| 0.9236111111111112 | 0 |
| 0.9243055555555556 | 0 |
| 0.9249999999999999 | 0 |
| 0.9256944444444444 | 0 |
| 0.9263888888888889 | 0 |
| 0.9270833333333334 | 0 |
| 0.9277777777777777 | 0 |
| 0.9284722222222223 | 0 |
| 0.9291666666666667 | 0 |
| 0.9298611111111111 | 0 |
| 0.9305555555555555 | 0 |
| 0.93125 | 0 |
| 0.9319444444444445 | 0 |
| 0.9326388888888889 | 0 |
| 0.9333333333333332 | 0 |
| 0.9340277777777778 | 0 |
| 0.9347222222222222 | 0 |
| 0.9354166666666667 | 0 |
| 0.936111111111111 | 0 |
| 0.9368055555555556 | 0 |
| 0.9375 | 0 |
| 0.9381944444444444 | 0 |
| 0.938888888888889 | 0 |
| 0.9395833333333333 | 0 |
| 0.9402777777777778 | 0 |
| 0.9409722222222222 | 0 |
| 0.9416666666666668 | 0 |
| 0.9423611111111111 | 0 |
| 0.9430555555555555 | 0 |
| 0.94375 | 0 |
| 0.9444444444444445 | 0 |
| 0.9451388888888889 | 0 |
| 0.9458333333333333 | 0 |
| 0.9465277777777777 | 0 |
| 0.9472222222222223 | 0 |
| 0.9479166666666666 | 0 |
| 0.9486111111111111 | 0 |
| 0.9493055555555556 | 0 |
| 0.9500000000000001 | 0 |
| 0.9506944444444444 | 0 |
| 0.9513888888888888 | 0 |
| 0.9520833333333334 | 0 |
| 0.9527777777777778 | 0 |
| 0.9534722222222222 | 0 |
| 0.9541666666666666 | 0 |
| 0.9548611111111112 | 0 |
| 0.9555555555555556 | 0 |
| 0.9562499999999999 | 0 |
| 0.9569444444444444 | 0 |
| 0.9576388888888889 | 0 |
| 0.9583333333333334 | 0 |
| 0.9590277777777777 | 0 |
| 0.9597222222222223 | 0 |
| 0.9604166666666667 | 0 |
| 0.9611111111111111 | 0 |
| 0.9618055555555555 | 0 |
| 0.9625 | 0 |
| 0.9631944444444445 | 0 |
| 0.9638888888888889 | 0 |
| 0.9645833333333332 | 0 |
| 0.9652777777777778 | 0 |
| 0.9659722222222222 | 0 |
| 0.9666666666666667 | 0 |
| 0.967361111111111 | 0 |
| 0.9680555555555556 | 0 |
| 0.96875 | 0 |
| 0.9694444444444444 | 0 |
| 0.970138888888889 | 0 |
| 0.9708333333333333 | 0 |
| 0.9715277777777778 | 0 |
| 0.9722222222222222 | 0 |
| 0.9729166666666668 | 0 |
| 0.9736111111111111 | 0 |
| 0.9743055555555555 | 0 |
| 0.975 | 0 |
| 0.9756944444444445 | 0 |
| 0.9763888888888889 | 0 |
| 0.9770833333333333 | 0 |
| 0.9777777777777777 | 0 |
| 0.9784722222222223 | 0 |
| 0.9791666666666666 | 0 |
| 0.9798611111111111 | 0 |
| 0.9805555555555556 | 0 |
| 0.9812500000000001 | 0 |
| 0.9819444444444444 | 0 |
| 0.9826388888888888 | 0 |
| 0.9833333333333334 | 0 |
| 0.9840277777777778 | 0 |
| 0.9847222222222222 | 0 |
| 0.9854166666666666 | 0 |
| 0.9861111111111112 | 0 |
| 0.9868055555555556 | 0 |
| 0.9874999999999999 | 0 |
| 0.9881944444444444 | 0 |
| 0.9888888888888889 | 0 |
| 0.9895833333333334 | 0 |
| 0.9902777777777777 | 0 |
| 0.9909722222222223 | 0 |
| 0.9916666666666667 | 0 |
| 0.9923611111111111 | 0 |
| 0.9930555555555555 | 0 |
| 0.99375 | 0 |
| 0.9944444444444445 | 0 |
| 0.9951388888888889 | 0 |
| 0.9958333333333332 | 0 |
| 0.9965277777777778 | 0 |
| 0.9972222222222222 | 0 |
| 0.9979166666666667 | 0 |
| 0.998611111111111 | 0 |
| 0.9993055555555556 | 0 |